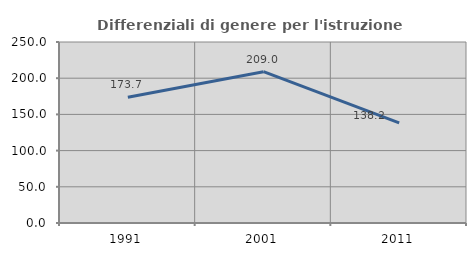
| Category | Differenziali di genere per l'istruzione superiore |
|---|---|
| 1991.0 | 173.652 |
| 2001.0 | 208.998 |
| 2011.0 | 138.249 |